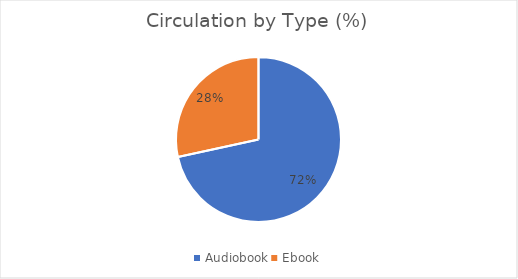
| Category | % |
|---|---|
| Audiobook | 0.716 |
| Ebook | 0.284 |